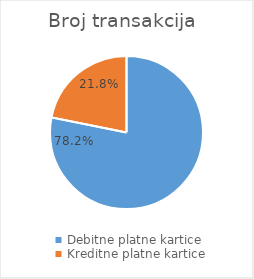
| Category | Broj transakcija  |
|---|---|
| Debitne platne kartice | 296901841 |
| Kreditne platne kartice | 82909317 |